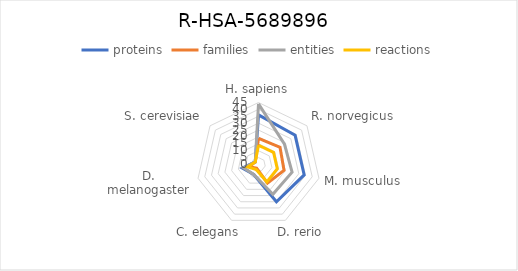
| Category | proteins | families | entities | reactions |
|---|---|---|---|---|
| H. sapiens | 36 | 19 | 44 | 14 |
| R. norvegicus | 34 | 20 | 24 | 14 |
| M. musculus | 34 | 19 | 25 | 14 |
| D. rerio | 30 | 15 | 24 | 14 |
| C. elegans | 8 | 3 | 8 | 4 |
| D. melanogaster | 12 | 7 | 11 | 8 |
| S. cerevisiae | 3 | 3 | 3 | 3 |